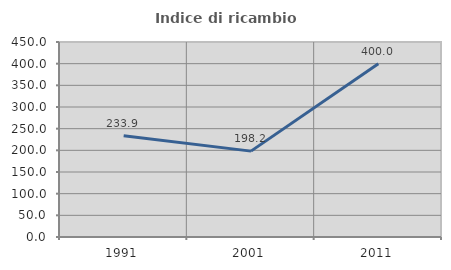
| Category | Indice di ricambio occupazionale  |
|---|---|
| 1991.0 | 233.871 |
| 2001.0 | 198.182 |
| 2011.0 | 400 |